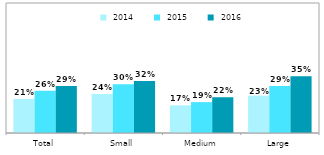
| Category |  2014 |  2015 |  2016 |
|---|---|---|---|
| Total | 0.21 | 0.26 | 0.29 |
| Small | 0.24 | 0.3 | 0.32 |
| Medium | 0.17 | 0.19 | 0.22 |
| Large | 0.23 | 0.29 | 0.35 |